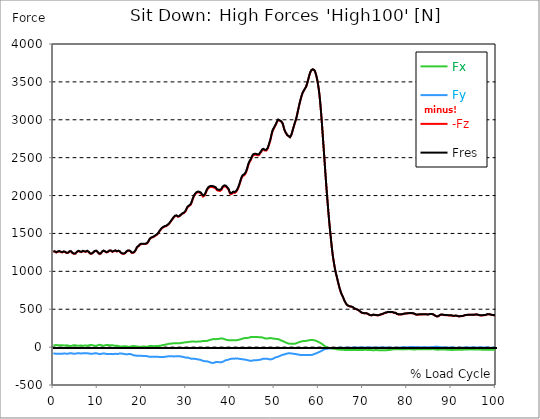
| Category |  Fx |  Fy |  -Fz |  Fres |
|---|---|---|---|---|
| 0.0 | 20.1 | -82.202 | 1262.724 | 1265.823 |
| 0.167348456675344 | 22.124 | -83.53 | 1262.439 | 1265.649 |
| 0.334696913350688 | 24.275 | -84.732 | 1260.177 | 1263.467 |
| 0.5020453700260321 | 26.251 | -86.329 | 1254.216 | 1257.663 |
| 0.669393826701376 | 27.77 | -88.1 | 1248.016 | 1251.622 |
| 0.83674228337672 | 26.046 | -88.496 | 1250.531 | 1254.121 |
| 1.0040907400520642 | 23.927 | -87.499 | 1258.359 | 1261.87 |
| 1.1621420602454444 | 22.282 | -85.997 | 1266.187 | 1269.571 |
| 1.3294905169207885 | 22.915 | -86.519 | 1264.843 | 1268.274 |
| 1.4968389735961325 | 23.927 | -87.072 | 1261.411 | 1264.922 |
| 1.6641874302714765 | 25.73 | -88.48 | 1254.01 | 1257.631 |
| 1.8315358869468206 | 27.343 | -90.393 | 1246.72 | 1250.483 |
| 1.9988843436221646 | 25.666 | -89.112 | 1249.329 | 1252.966 |
| 2.1662328002975086 | 23.658 | -87.12 | 1254.121 | 1257.6 |
| 2.333581256972853 | 21.839 | -84.526 | 1259.924 | 1263.198 |
| 2.5009297136481967 | 21.27 | -83.91 | 1258.375 | 1261.601 |
| 2.6682781703235405 | 21.381 | -84.732 | 1254.216 | 1257.489 |
| 2.8356266269988843 | 23.294 | -86.187 | 1246.198 | 1249.614 |
| 3.002975083674229 | 23.863 | -86.993 | 1242.197 | 1245.66 |
| 3.1703235403495724 | 22.741 | -86.63 | 1241.248 | 1244.664 |
| 3.337671997024917 | 21.27 | -86.313 | 1243.794 | 1247.147 |
| 3.4957233172182973 | 18.518 | -84.764 | 1251.733 | 1254.911 |
| 3.663071773893641 | 15.134 | -81.711 | 1262.012 | 1264.953 |
| 3.8304202305689854 | 13.853 | -79.972 | 1265.222 | 1268.037 |
| 3.997768687244329 | 14.486 | -80.019 | 1262.724 | 1265.554 |
| 4.165117143919673 | 17.791 | -81.601 | 1252.65 | 1255.623 |
| 4.332465600595017 | 21.57 | -84.273 | 1239.935 | 1243.177 |
| 4.499814057270361 | 24.164 | -86.724 | 1230.131 | 1233.641 |
| 4.667162513945706 | 23.737 | -87.12 | 1230.605 | 1234.132 |
| 4.834510970621049 | 22.946 | -85.823 | 1232.44 | 1235.84 |
| 5.001859427296393 | 24.116 | -86.124 | 1233.752 | 1237.168 |
| 5.169207883971737 | 22.203 | -84.764 | 1241.343 | 1244.616 |
| 5.336556340647081 | 18.961 | -82.439 | 1255.323 | 1258.406 |
| 5.503904797322425 | 18.55 | -80.905 | 1263.957 | 1266.946 |
| 5.671253253997769 | 18.518 | -80.525 | 1267.942 | 1270.884 |
| 5.82930457419115 | 18.724 | -80.604 | 1267.642 | 1270.583 |
| 5.996653030866494 | 19.973 | -81.964 | 1260.241 | 1263.293 |
| 6.164001487541838 | 21.618 | -84.273 | 1251.195 | 1254.437 |
| 6.331349944217181 | 21.207 | -84.843 | 1252.729 | 1256.003 |
| 6.498698400892526 | 18.882 | -83.087 | 1259.45 | 1262.55 |
| 6.66604685756787 | 15.862 | -80.272 | 1267.737 | 1270.599 |
| 6.833395314243213 | 17.601 | -80.652 | 1266.725 | 1269.634 |
| 7.000743770918558 | 20.021 | -81.617 | 1261.348 | 1264.352 |
| 7.168092227593902 | 21.017 | -82.518 | 1255.338 | 1258.422 |
| 7.335440684269246 | 20.036 | -82.17 | 1257.695 | 1260.747 |
| 7.50278914094459 | 18.882 | -81.474 | 1264.242 | 1267.231 |
| 7.6701375976199335 | 18.376 | -80.304 | 1268.464 | 1271.358 |
| 7.837486054295278 | 20.432 | -81 | 1264.716 | 1267.689 |
| 7.995537374488658 | 23.531 | -83.514 | 1254.026 | 1257.236 |
| 8.162885831164003 | 26.077 | -86.851 | 1240.805 | 1244.348 |
| 8.330234287839346 | 27.343 | -89.081 | 1232.234 | 1236.029 |
| 8.49758274451469 | 27.358 | -89.761 | 1230.02 | 1233.894 |
| 8.664931201190035 | 26.536 | -89.128 | 1232.803 | 1236.599 |
| 8.832279657865378 | 25.081 | -87.879 | 1237.848 | 1241.485 |
| 8.999628114540721 | 22.63 | -86.234 | 1245.265 | 1248.712 |
| 9.166976571216066 | 18.06 | -83.736 | 1257.679 | 1260.873 |
| 9.334325027891412 | 16.289 | -82.044 | 1265.934 | 1269.018 |
| 9.501673484566755 | 16.478 | -81.506 | 1268.179 | 1271.247 |
| 9.669021941242098 | 16.984 | -81.553 | 1270.504 | 1273.556 |
| 9.836370397917442 | 19.119 | -82.044 | 1265.001 | 1268.116 |
| 10.003718854592787 | 22.946 | -84.511 | 1254.753 | 1258.058 |
| 10.17106731126813 | 26.995 | -87.673 | 1242.292 | 1245.976 |
| 10.329118631461512 | 30.268 | -90.472 | 1231.491 | 1235.523 |
| 10.496467088136853 | 30.347 | -91.121 | 1228.043 | 1232.139 |
| 10.663815544812199 | 28.624 | -90.662 | 1231.254 | 1235.27 |
| 10.831164001487544 | 25.619 | -89.302 | 1240.331 | 1244.142 |
| 10.998512458162887 | 20.985 | -86.06 | 1257.631 | 1261.079 |
| 11.16586091483823 | 18.423 | -83.435 | 1270.061 | 1273.256 |
| 11.333209371513574 | 18.882 | -82.755 | 1270.868 | 1274.015 |
| 11.50055782818892 | 20.922 | -83.72 | 1266.883 | 1270.109 |
| 11.667906284864264 | 22.519 | -85.285 | 1261.964 | 1265.317 |
| 11.835254741539607 | 24.749 | -87.357 | 1255.924 | 1259.434 |
| 12.00260319821495 | 27.849 | -90.03 | 1249.503 | 1253.314 |
| 12.169951654890292 | 29.24 | -92.228 | 1248.87 | 1252.887 |
| 12.337300111565641 | 27.928 | -92.544 | 1255.481 | 1259.513 |
| 12.504648568240984 | 26.204 | -92.07 | 1264.89 | 1268.844 |
| 12.662699888434362 | 24.923 | -91.706 | 1272.354 | 1276.213 |
| 12.830048345109708 | 23.99 | -91.579 | 1274.537 | 1278.332 |
| 12.997396801785053 | 23.531 | -91.342 | 1272.275 | 1276.023 |
| 13.164745258460396 | 23.832 | -91.39 | 1265.317 | 1269.065 |
| 13.33209371513574 | 24.844 | -92.686 | 1257.268 | 1261.142 |
| 13.499442171811083 | 23.769 | -93.461 | 1256.398 | 1260.288 |
| 13.666790628486426 | 20.843 | -91.722 | 1264.368 | 1268.085 |
| 13.834139085161771 | 18.234 | -89.318 | 1271.88 | 1275.375 |
| 14.001487541837117 | 16.542 | -86.867 | 1273.904 | 1277.178 |
| 14.16883599851246 | 18.091 | -88.496 | 1267.958 | 1271.342 |
| 14.336184455187803 | 19.625 | -90.899 | 1261.553 | 1265.127 |
| 14.503532911863147 | 17.917 | -91.042 | 1264.463 | 1268.005 |
| 14.670881368538492 | 14.359 | -89.097 | 1269.508 | 1272.86 |
| 14.828932688731873 | 10.943 | -86.44 | 1271.026 | 1274.173 |
| 14.996281145407215 | 9.03 | -83.736 | 1262.945 | 1265.934 |
| 15.163629602082558 | 8.429 | -82.36 | 1248.744 | 1251.67 |
| 15.330978058757903 | 9.488 | -84.337 | 1239.935 | 1243.019 |
| 15.498326515433247 | 8.761 | -85.839 | 1235.239 | 1238.449 |
| 15.665674972108594 | 8.698 | -87.325 | 1231.934 | 1235.286 |
| 15.833023428783937 | 9.947 | -88.859 | 1230.827 | 1234.321 |
| 16.00037188545928 | 10.69 | -89.397 | 1231.475 | 1235.001 |
| 16.167720342134626 | 12.114 | -92.085 | 1236.504 | 1240.252 |
| 16.335068798809967 | 12.556 | -95.391 | 1246.229 | 1250.294 |
| 16.502417255485312 | 10.675 | -95.912 | 1257.505 | 1261.585 |
| 16.669765712160658 | 8.128 | -94.632 | 1266.661 | 1270.583 |
| 16.837114168836 | 6.405 | -94.046 | 1271.105 | 1274.916 |
| 17.004462625511344 | 3.653 | -91.627 | 1274.489 | 1278.111 |
| 17.16251394570472 | 3.258 | -90.789 | 1272.56 | 1276.086 |
| 17.32986240238007 | 3.179 | -89.951 | 1269.334 | 1272.813 |
| 17.497210859055414 | 5.835 | -91.643 | 1259.687 | 1263.293 |
| 17.664559315730756 | 10.232 | -96.308 | 1245.296 | 1249.234 |
| 17.8319077724061 | 13.742 | -101.7 | 1241.058 | 1245.518 |
| 17.999256229081443 | 14.407 | -105.259 | 1242.671 | 1247.463 |
| 18.166604685756788 | 13.426 | -106.413 | 1247.589 | 1252.476 |
| 18.333953142432133 | 13.015 | -109.086 | 1253.804 | 1258.912 |
| 18.501301599107478 | 12.019 | -110.794 | 1265.333 | 1270.567 |
| 18.668650055782823 | 11.07 | -112.739 | 1283.646 | 1288.975 |
| 18.835998512458165 | 8.745 | -113.972 | 1306.37 | 1311.684 |
| 19.00334696913351 | 6.658 | -113.292 | 1320.587 | 1325.79 |
| 19.170695425808855 | 5.756 | -113.023 | 1327.941 | 1333.065 |
| 19.338043882484197 | 6.12 | -113.972 | 1334.741 | 1339.928 |
| 19.496095202677576 | 6.199 | -115.127 | 1348.325 | 1353.56 |
| 19.66344365935292 | 6.326 | -115.728 | 1356.912 | 1362.178 |
| 19.830792116028263 | 6.231 | -115.585 | 1358.62 | 1363.87 |
| 19.998140572703612 | 5.851 | -115.285 | 1358.984 | 1364.218 |
| 20.165489029378953 | 6.61 | -115.791 | 1359.632 | 1364.914 |
| 20.3328374860543 | 7.29 | -116.297 | 1360.17 | 1365.515 |
| 20.500185942729644 | 7.037 | -116.929 | 1359.348 | 1364.709 |
| 20.667534399404985 | 6.8 | -117.562 | 1358.525 | 1363.902 |
| 20.83488285608033 | 5.661 | -117.799 | 1359.775 | 1365.151 |
| 21.002231312755672 | 4.681 | -118.147 | 1361.609 | 1366.954 |
| 21.16957976943102 | 5.329 | -119.475 | 1367.033 | 1372.473 |
| 21.336928226106362 | 6.436 | -121.484 | 1376.126 | 1381.725 |
| 21.504276682781704 | 10.864 | -125.754 | 1392.194 | 1398.155 |
| 21.67162513945705 | 13.505 | -127.651 | 1412.894 | 1418.935 |
| 21.82967645965043 | 13.679 | -127.303 | 1428.028 | 1433.943 |
| 21.997024916325774 | 12.983 | -126.845 | 1436.141 | 1441.945 |
| 22.16437337300112 | 13.458 | -126.797 | 1442.672 | 1448.476 |
| 22.33172182967646 | 13.379 | -126.291 | 1446.673 | 1452.414 |
| 22.499070286351806 | 11.544 | -125.263 | 1449.346 | 1454.944 |
| 22.666418743027148 | 12.177 | -125.58 | 1453.125 | 1458.755 |
| 22.833767199702496 | 13.363 | -127.446 | 1460.036 | 1465.808 |
| 23.00111565637784 | 13.505 | -128.157 | 1468.734 | 1474.538 |
| 23.168464113053183 | 13.331 | -127.43 | 1473.937 | 1479.63 |
| 23.335812569728528 | 13.41 | -127.383 | 1479.329 | 1485.006 |
| 23.50316102640387 | 14.28 | -127.873 | 1487.094 | 1492.819 |
| 23.670509483079215 | 14.881 | -128.505 | 1497.816 | 1503.572 |
| 23.83785793975456 | 15.988 | -130.276 | 1512.618 | 1518.485 |
| 23.995909259947936 | 16.795 | -129.786 | 1528.59 | 1534.394 |
| 24.163257716623285 | 17.554 | -129.723 | 1542 | 1547.757 |
| 24.330606173298627 | 19.831 | -130.229 | 1552.944 | 1558.763 |
| 24.49795462997397 | 23.136 | -131.178 | 1565.2 | 1571.13 |
| 24.665303086649313 | 25.714 | -131.383 | 1572.49 | 1578.436 |
| 24.83265154332466 | 27.754 | -131.051 | 1580.35 | 1586.264 |
| 25.0 | 28.924 | -129.865 | 1588.51 | 1594.329 |
| 25.167348456675345 | 30.126 | -128.616 | 1590.629 | 1596.338 |
| 25.334696913350694 | 31.85 | -127.035 | 1593.112 | 1598.726 |
| 25.502045370026035 | 34.222 | -124.979 | 1596.053 | 1601.54 |
| 25.669393826701377 | 36.926 | -123.065 | 1602.315 | 1607.724 |
| 25.836742283376722 | 39.788 | -121.389 | 1609.621 | 1614.967 |
| 26.004090740052067 | 42.477 | -121.958 | 1619.189 | 1624.629 |
| 26.17143919672741 | 43.584 | -121.199 | 1626.811 | 1632.22 |
| 26.329490516920792 | 44.469 | -120.598 | 1638.166 | 1643.527 |
| 26.49683897359613 | 45.576 | -120.108 | 1653.347 | 1658.677 |
| 26.66418743027148 | 47.158 | -119.902 | 1667.027 | 1672.34 |
| 26.831535886946828 | 46.968 | -120.266 | 1678.413 | 1683.71 |
| 26.998884343622166 | 48.802 | -122.037 | 1692.914 | 1698.339 |
| 27.166232800297514 | 50.162 | -122.48 | 1708.618 | 1714.074 |
| 27.333581256972852 | 51.491 | -123.034 | 1720.115 | 1725.618 |
| 27.5009297136482 | 51.348 | -122.195 | 1727.879 | 1733.288 |
| 27.668278170323543 | 51.554 | -121.088 | 1734.157 | 1739.471 |
| 27.835626626998888 | 51.76 | -120.124 | 1733.983 | 1739.234 |
| 28.002975083674233 | 52.013 | -120.82 | 1727.247 | 1732.576 |
| 28.170323540349575 | 50.336 | -121.12 | 1720.336 | 1725.665 |
| 28.33767199702492 | 49.893 | -120.567 | 1721.696 | 1726.994 |
| 28.50502045370026 | 51.839 | -121.389 | 1725.286 | 1730.694 |
| 28.663071773893645 | 51.522 | -121.436 | 1734.221 | 1739.629 |
| 28.830420230568986 | 53.847 | -123.903 | 1744.168 | 1749.813 |
| 28.99776868724433 | 55.808 | -126.117 | 1755.475 | 1761.326 |
| 29.165117143919673 | 56.883 | -126.956 | 1759.112 | 1765.074 |
| 29.33246560059502 | 57.895 | -128.822 | 1763.398 | 1769.581 |
| 29.499814057270367 | 59.129 | -131.178 | 1768.427 | 1774.863 |
| 29.66716251394571 | 62.039 | -134.736 | 1776.792 | 1783.766 |
| 29.834510970621054 | 64.506 | -137.899 | 1786.85 | 1794.298 |
| 30.00185942729639 | 65.217 | -139.006 | 1804.593 | 1812.168 |
| 30.169207883971744 | 64.98 | -137.772 | 1826.986 | 1834.45 |
| 30.33655634064708 | 65.217 | -137.25 | 1846.09 | 1853.506 |
| 30.50390479732243 | 67.052 | -140.002 | 1855.214 | 1862.9 |
| 30.671253253997772 | 68.586 | -143.639 | 1861.066 | 1869.162 |
| 30.829304574191156 | 70.135 | -147.261 | 1866.917 | 1875.409 |
| 30.996653030866494 | 71.401 | -149.712 | 1876.026 | 1884.771 |
| 31.164001487541842 | 73.298 | -152.701 | 1893.437 | 1902.404 |
| 31.331349944217187 | 74.532 | -154.298 | 1920.447 | 1929.477 |
| 31.498698400892525 | 74.279 | -154.298 | 1949.53 | 1958.401 |
| 31.666046857567874 | 73.346 | -153.602 | 1974.073 | 1982.802 |
| 31.833395314243212 | 72.682 | -153.713 | 1995.596 | 2004.215 |
| 32.00074377091856 | 72.223 | -154.693 | 2013.529 | 2022.116 |
| 32.1680922275939 | 71.401 | -155.99 | 2026.022 | 2034.673 |
| 32.33544068426925 | 71.575 | -158.014 | 2034.341 | 2043.149 |
| 32.50278914094459 | 72.334 | -159.928 | 2039.717 | 2048.684 |
| 32.670137597619934 | 72.84 | -162.126 | 2043.544 | 2052.637 |
| 32.83748605429528 | 72.555 | -163.091 | 2045.41 | 2054.519 |
| 33.004834510970625 | 73.662 | -165.321 | 2041.156 | 2050.423 |
| 33.162885831164004 | 74.247 | -167.234 | 2036.523 | 2046.027 |
| 33.33023428783935 | 74.816 | -169.337 | 2030.593 | 2040.366 |
| 33.497582744514695 | 76.477 | -173.212 | 2018.4 | 2028.568 |
| 33.664931201190036 | 78.912 | -177.624 | 2000.245 | 2010.841 |
| 33.83227965786538 | 81 | -181.783 | 1986.693 | 1997.747 |
| 33.99962811454073 | 81.569 | -184.408 | 1989.998 | 2001.4 |
| 34.16697657121607 | 81.522 | -185.389 | 2001.621 | 2013.118 |
| 34.33432502789141 | 81.49 | -186.369 | 2015.854 | 2027.43 |
| 34.50167348456676 | 81.284 | -186.575 | 2038.689 | 2050.234 |
| 34.6690219412421 | 80.731 | -186.511 | 2064.925 | 2076.438 |
| 34.83637039791744 | 83.119 | -188.947 | 2081.182 | 2092.963 |
| 35.00371885459279 | 86.756 | -192.315 | 2095.43 | 2107.591 |
| 35.17106731126814 | 90.156 | -194.893 | 2105.298 | 2117.776 |
| 35.338415767943474 | 92.829 | -197.233 | 2109.884 | 2122.646 |
| 35.49646708813686 | 95.375 | -201.108 | 2112.668 | 2125.936 |
| 35.6638155448122 | 99.17 | -205.441 | 2113.933 | 2127.818 |
| 35.831164001487544 | 101.764 | -208.904 | 2113.158 | 2127.596 |
| 35.998512458162885 | 103.883 | -210.122 | 2111.497 | 2126.252 |
| 36.165860914838234 | 105.844 | -209.046 | 2109.505 | 2124.275 |
| 36.333209371513576 | 106.951 | -207.165 | 2104.555 | 2119.246 |
| 36.50055782818892 | 106.824 | -203.67 | 2100.016 | 2114.391 |
| 36.667906284864266 | 104.721 | -197.581 | 2097.281 | 2110.849 |
| 36.83525474153961 | 104.389 | -196.791 | 2084.898 | 2098.277 |
| 37.002603198214956 | 106.002 | -197.692 | 2070.144 | 2083.728 |
| 37.1699516548903 | 108.089 | -198.815 | 2059.691 | 2073.544 |
| 37.337300111565646 | 107.805 | -197.55 | 2064.292 | 2077.972 |
| 37.50464856824098 | 109.149 | -198.135 | 2064.435 | 2078.288 |
| 37.66269988843437 | 111.901 | -200.428 | 2060.703 | 2075.014 |
| 37.83004834510971 | 114.209 | -201.772 | 2063.264 | 2077.893 |
| 37.99739680178505 | 115.981 | -201.266 | 2073.718 | 2088.409 |
| 38.16474525846039 | 113.355 | -196.711 | 2094.292 | 2108.793 |
| 38.33209371513574 | 110.73 | -192.932 | 2108.24 | 2122.425 |
| 38.49944217181109 | 109.054 | -189.042 | 2115.941 | 2129.652 |
| 38.666790628486424 | 106.745 | -183.238 | 2121.634 | 2134.744 |
| 38.83413908516178 | 102.08 | -177.829 | 2122.283 | 2134.713 |
| 39.001487541837115 | 97.794 | -172.753 | 2118.124 | 2130.079 |
| 39.16883599851246 | 95.217 | -170.555 | 2107.939 | 2119.737 |
| 39.336184455187805 | 93.92 | -169.764 | 2097.486 | 2109.22 |
| 39.503532911863154 | 92.623 | -167.566 | 2087.523 | 2099.162 |
| 39.670881368538495 | 90.789 | -163.866 | 2072.184 | 2083.665 |
| 39.83822982521384 | 91.295 | -159.722 | 2040.524 | 2052.021 |
| 39.996281145407224 | 90.457 | -156.354 | 2022.085 | 2033.597 |
| 40.163629602082565 | 90.82 | -154.346 | 2016.866 | 2028.537 |
| 40.33097805875791 | 91.342 | -153.681 | 2021.974 | 2033.74 |
| 40.498326515433256 | 91.073 | -152.195 | 2032.68 | 2044.288 |
| 40.6656749721086 | 91.073 | -151.641 | 2039.575 | 2051.214 |
| 40.83302342878393 | 91.358 | -152.116 | 2035.416 | 2047.292 |
| 41.00037188545929 | 91.959 | -152.29 | 2034.246 | 2046.328 |
| 41.16772034213463 | 91.769 | -151.357 | 2038.689 | 2050.866 |
| 41.33506879880997 | 90.884 | -149.491 | 2048.842 | 2061.035 |
| 41.50241725548531 | 90.71 | -148.479 | 2061.968 | 2074.066 |
| 41.66976571216066 | 92.528 | -150.171 | 2080.027 | 2092.236 |
| 41.837114168836 | 95.612 | -152.068 | 2103.401 | 2115.751 |
| 42.004462625511344 | 98.395 | -154.535 | 2130.617 | 2142.968 |
| 42.17181108218669 | 101.353 | -156.971 | 2160.537 | 2172.856 |
| 42.32986240238007 | 103.788 | -157.619 | 2192.75 | 2204.959 |
| 42.497210859055414 | 106.081 | -157.366 | 2221.405 | 2233.456 |
| 42.66455931573076 | 109.244 | -159.153 | 2244.715 | 2256.797 |
| 42.831907772406105 | 112.754 | -161.177 | 2258.742 | 2271.03 |
| 42.999256229081446 | 116.028 | -162.711 | 2263.186 | 2275.806 |
| 43.16660468575679 | 117.926 | -162.996 | 2268.263 | 2281.04 |
| 43.33395314243214 | 119.744 | -164.799 | 2278.194 | 2291.177 |
| 43.50130159910748 | 120.804 | -167.424 | 2296.206 | 2309.316 |
| 43.66865005578282 | 120.646 | -169.132 | 2321.904 | 2334.935 |
| 43.83599851245817 | 120.978 | -170.476 | 2350.986 | 2363.985 |
| 44.00334696913351 | 122.338 | -173.212 | 2386.188 | 2399.33 |
| 44.17069542580886 | 123.872 | -176.896 | 2417.563 | 2430.847 |
| 44.3380438824842 | 126.228 | -178.968 | 2439.276 | 2452.766 |
| 44.49609520267758 | 131.225 | -182.51 | 2449.381 | 2463.772 |
| 44.66344365935292 | 133.993 | -180.913 | 2469.623 | 2483.888 |
| 44.83079211602827 | 134.689 | -178.889 | 2495.59 | 2509.586 |
| 44.99814057270361 | 134.704 | -178.114 | 2514.852 | 2528.752 |
| 45.16548902937895 | 133.471 | -175.774 | 2531.061 | 2544.661 |
| 45.332837486054295 | 132.269 | -172.785 | 2537.418 | 2550.718 |
| 45.500185942729644 | 132.522 | -171.33 | 2538.146 | 2551.287 |
| 45.66753439940499 | 132.538 | -172.136 | 2540.091 | 2553.264 |
| 45.83488285608033 | 133.503 | -172.484 | 2537.165 | 2550.465 |
| 46.00223131275568 | 134.594 | -171.899 | 2532.057 | 2545.452 |
| 46.16957976943102 | 133.06 | -171.63 | 2530.397 | 2543.618 |
| 46.336928226106366 | 131.526 | -171.361 | 2528.752 | 2541.783 |
| 46.50427668278171 | 131.241 | -171.14 | 2534.809 | 2547.84 |
| 46.671625139457056 | 131.051 | -166.601 | 2548.963 | 2561.393 |
| 46.829676459650436 | 131.526 | -165.02 | 2556.253 | 2568.604 |
| 46.99702491632577 | 130.087 | -163.122 | 2575.277 | 2587.486 |
| 47.16437337300112 | 127.651 | -158.188 | 2595.519 | 2607.238 |
| 47.33172182967646 | 125.706 | -154.678 | 2603.774 | 2615.097 |
| 47.49907028635181 | 124.726 | -153.239 | 2605.704 | 2616.837 |
| 47.66641874302716 | 120.187 | -152.938 | 2594.049 | 2604.881 |
| 47.83376719970249 | 116.344 | -154.804 | 2593.163 | 2603.948 |
| 48.001115656377834 | 112.581 | -153.428 | 2589.842 | 2600.358 |
| 48.16846411305319 | 111.268 | -153.049 | 2593.717 | 2604.027 |
| 48.33581256972853 | 112.486 | -154.124 | 2603.442 | 2614.006 |
| 48.50316102640387 | 114.652 | -156.401 | 2623.052 | 2634.074 |
| 48.67050948307921 | 116.36 | -158.378 | 2653.494 | 2664.801 |
| 48.837857939754564 | 118.416 | -160.592 | 2684.553 | 2696.097 |
| 49.005206396429905 | 119.744 | -162.332 | 2714.884 | 2726.492 |
| 49.163257716623285 | 119.523 | -162.569 | 2754.467 | 2765.869 |
| 49.33060617329863 | 117.388 | -159.659 | 2800.233 | 2810.971 |
| 49.49795462997397 | 114.905 | -156.686 | 2839.088 | 2849.193 |
| 49.66530308664932 | 112.913 | -153.839 | 2865.687 | 2875.334 |
| 49.832651543324666 | 111.711 | -147.798 | 2879.224 | 2888.286 |
| 50.0 | 110.794 | -141.283 | 2900.526 | 2908.891 |
| 50.16734845667534 | 109.687 | -137.598 | 2919.218 | 2927.093 |
| 50.33469691335069 | 108.374 | -134.341 | 2939.065 | 2946.466 |
| 50.50204537002604 | 106.824 | -132.411 | 2962.217 | 2969.333 |
| 50.66939382670139 | 106.698 | -129.739 | 2982.569 | 2989.401 |
| 50.836742283376715 | 104.863 | -125.358 | 2997.261 | 3003.539 |
| 51.00409074005207 | 103.361 | -122.148 | 3002.337 | 3008.125 |
| 51.17143919672741 | 97.32 | -117.151 | 2987.993 | 2993.228 |
| 51.32949051692079 | 90.725 | -112.739 | 2977.809 | 2982.553 |
| 51.496838973596134 | 86.788 | -108.69 | 2977.208 | 2981.62 |
| 51.66418743027148 | 84.542 | -105.464 | 2969.712 | 2973.871 |
| 51.831535886946824 | 80.415 | -101.922 | 2951.7 | 2955.59 |
| 51.99888434362217 | 75.797 | -99.028 | 2918.775 | 2922.318 |
| 52.16623280029752 | 71.242 | -96.592 | 2879.256 | 2882.466 |
| 52.33358125697285 | 66.894 | -94.347 | 2853.637 | 2856.594 |
| 52.5009297136482 | 61.517 | -90.33 | 2832.051 | 2834.613 |
| 52.668278170323546 | 57.706 | -87.958 | 2818.166 | 2820.522 |
| 52.835626626998895 | 53.594 | -86.329 | 2799.189 | 2801.403 |
| 53.00297508367424 | 50.289 | -83.23 | 2789.716 | 2791.788 |
| 53.17032354034958 | 47.458 | -79.671 | 2784.593 | 2786.569 |
| 53.33767199702492 | 46.304 | -80.889 | 2775.073 | 2777.018 |
| 53.50502045370027 | 45.892 | -83.087 | 2768.731 | 2770.66 |
| 53.663071773893655 | 43.868 | -83.34 | 2780.861 | 2782.679 |
| 53.83042023056899 | 43.331 | -84.779 | 2803 | 2804.819 |
| 53.99776868724433 | 43.331 | -84.827 | 2837.048 | 2838.835 |
| 54.16511714391967 | 43.204 | -86.424 | 2871.349 | 2873.152 |
| 54.33246560059503 | 43.078 | -88.005 | 2905.665 | 2907.468 |
| 54.49981405727037 | 43.679 | -89.935 | 2938.669 | 2940.504 |
| 54.667162513945705 | 45.687 | -91.975 | 2969.38 | 2971.31 |
| 54.834510970621054 | 48.217 | -92.117 | 3000.123 | 3002.052 |
| 55.0018594272964 | 50.906 | -92.892 | 3035.705 | 3037.666 |
| 55.169207883971744 | 55.049 | -95.185 | 3079.778 | 3081.85 |
| 55.336556340647086 | 60.979 | -98.3 | 3125.924 | 3128.154 |
| 55.50390479732243 | 63.62 | -99.66 | 3169.903 | 3172.196 |
| 55.671253253997776 | 66.815 | -101.716 | 3213.471 | 3215.875 |
| 55.83860171067312 | 70.989 | -103.551 | 3253.18 | 3255.71 |
| 55.9966530308665 | 73.757 | -104.025 | 3288.651 | 3291.244 |
| 56.16400148754184 | 75.765 | -104.12 | 3321.022 | 3323.648 |
| 56.33134994421718 | 78.248 | -104.057 | 3349.915 | 3352.572 |
| 56.498698400892536 | 79.15 | -103.361 | 3370.315 | 3372.956 |
| 56.66604685756788 | 79.909 | -103.108 | 3387.268 | 3389.909 |
| 56.83339531424321 | 80.193 | -102.807 | 3403.793 | 3406.419 |
| 57.00074377091856 | 80.478 | -102.491 | 3420.319 | 3422.944 |
| 57.16809222759391 | 80.968 | -102.301 | 3438.743 | 3441.368 |
| 57.33544068426925 | 83.878 | -103.756 | 3467.856 | 3470.576 |
| 57.5027891409446 | 86.74 | -105.353 | 3501.113 | 3503.944 |
| 57.670137597619934 | 89.144 | -105.717 | 3538.292 | 3541.17 |
| 57.83748605429528 | 91.073 | -105.037 | 3577.701 | 3580.595 |
| 58.004834510970625 | 92.418 | -104.768 | 3609.329 | 3612.223 |
| 58.16288583116401 | 93.192 | -103.677 | 3635.739 | 3638.601 |
| 58.330234287839346 | 94.663 | -102.76 | 3652.739 | 3655.601 |
| 58.497582744514695 | 95.343 | -101.653 | 3660.994 | 3663.824 |
| 58.66493120119004 | 94.821 | -99.486 | 3664.378 | 3667.13 |
| 58.832279657865385 | 93.192 | -95.691 | 3663.034 | 3665.659 |
| 58.999628114540734 | 90.014 | -91.01 | 3653.466 | 3655.917 |
| 59.16697657121607 | 86.867 | -87.041 | 3635.581 | 3637.874 |
| 59.33432502789142 | 83.91 | -83.751 | 3605.708 | 3607.89 |
| 59.50167348456676 | 80.43 | -80.177 | 3569.794 | 3571.85 |
| 59.66902194124211 | 76.082 | -75.971 | 3523.411 | 3525.246 |
| 59.83637039791745 | 71.053 | -71.796 | 3468.441 | 3470.118 |
| 60.00371885459278 | 66.799 | -67.937 | 3407.415 | 3408.949 |
| 60.17106731126813 | 61.77 | -63.478 | 3326.51 | 3327.902 |
| 60.33841576794349 | 56.488 | -58.37 | 3230.076 | 3231.293 |
| 60.49646708813685 | 51.032 | -53.942 | 3116.372 | 3117.448 |
| 60.6638155448122 | 44.343 | -48.96 | 2994.114 | 2995.047 |
| 60.831164001487544 | 37.242 | -43.758 | 2858.587 | 2859.393 |
| 60.99851245816289 | 29.066 | -37.4 | 2717.715 | 2718.379 |
| 61.16586091483824 | 21.333 | -32.261 | 2581.682 | 2582.267 |
| 61.333209371513576 | 14.075 | -28.339 | 2442.249 | 2442.739 |
| 61.50055782818892 | 8.255 | -25.461 | 2302.548 | 2302.99 |
| 61.667906284864266 | 3.147 | -23.168 | 2166.673 | 2167.068 |
| 61.835254741539615 | -1.139 | -21.665 | 2037.725 | 2038.104 |
| 62.002603198214956 | -4.238 | -20.875 | 1913.853 | 1914.217 |
| 62.16995165489029 | -7.954 | -19.293 | 1793.697 | 1794.077 |
| 62.33730011156564 | -10.722 | -17.854 | 1681.892 | 1682.303 |
| 62.504648568240995 | -12.873 | -16.035 | 1577.788 | 1578.246 |
| 62.67199702491633 | -15.134 | -13.901 | 1479.124 | 1479.598 |
| 62.83004834510971 | -17.396 | -12.873 | 1383.875 | 1384.381 |
| 62.99739680178505 | -19.151 | -12.398 | 1295.174 | 1295.728 |
| 63.1647452584604 | -20.448 | -12.114 | 1214.238 | 1214.838 |
| 63.33209371513575 | -21.317 | -12.129 | 1148.087 | 1148.736 |
| 63.4994421718111 | -21.27 | -13.252 | 1089.227 | 1089.86 |
| 63.666790628486424 | -21.823 | -13.505 | 1033.83 | 1034.4 |
| 63.83413908516177 | -24.116 | -12.129 | 988.286 | 988.824 |
| 64.00148754183712 | -26.916 | -10.706 | 947.928 | 948.498 |
| 64.16883599851248 | -29.288 | -9.694 | 908.187 | 908.788 |
| 64.3361844551878 | -30.363 | -9.552 | 865.315 | 865.98 |
| 64.50353291186315 | -30.98 | -9.046 | 825.891 | 826.587 |
| 64.6708813685385 | -30.948 | -9.473 | 787.842 | 788.585 |
| 64.83822982521384 | -33.684 | -8.714 | 754.87 | 755.771 |
| 65.00557828188919 | -34.475 | -8.808 | 724.95 | 725.914 |
| 65.16362960208257 | -34.032 | -9.141 | 699.568 | 700.564 |
| 65.3309780587579 | -33.336 | -11.054 | 678.409 | 679.452 |
| 65.49832651543326 | -35.044 | -9.963 | 658.277 | 659.463 |
| 65.6656749721086 | -36.246 | -9.473 | 632.39 | 633.671 |
| 65.83302342878395 | -36.926 | -9.821 | 609.95 | 611.341 |
| 66.00037188545929 | -38.365 | -9.378 | 591.779 | 593.281 |
| 66.16772034213463 | -39.124 | -9.235 | 574.637 | 576.25 |
| 66.33506879880998 | -39.504 | -8.872 | 560.309 | 562.017 |
| 66.50241725548531 | -39.836 | -8.255 | 550.014 | 551.769 |
| 66.66976571216065 | -39.772 | -8.397 | 544.954 | 546.725 |
| 66.83711416883601 | -39.535 | -8.445 | 540.905 | 542.661 |
| 67.00446262551135 | -39.156 | -8.445 | 537.632 | 539.403 |
| 67.1718110821867 | -39.251 | -7.828 | 535.687 | 537.442 |
| 67.32986240238007 | -39.44 | -7.164 | 533.994 | 535.75 |
| 67.49721085905541 | -39.409 | -6.942 | 531.954 | 533.726 |
| 67.66455931573076 | -39.314 | -6.768 | 528.317 | 530.088 |
| 67.83190777240611 | -39.092 | -6.721 | 519.714 | 521.485 |
| 67.99925622908145 | -39.124 | -6.531 | 511.538 | 513.341 |
| 68.16660468575678 | -38.887 | -6.136 | 505.45 | 507.253 |
| 68.33395314243214 | -38.017 | -5.646 | 503.204 | 504.944 |
| 68.50130159910749 | -38.001 | -5.772 | 500.389 | 502.161 |
| 68.66865005578282 | -38.08 | -5.472 | 495.93 | 497.717 |
| 68.83599851245816 | -38.144 | -5.108 | 491.138 | 492.941 |
| 69.00334696913352 | -38.144 | -4.792 | 486.536 | 488.355 |
| 69.17069542580886 | -38.017 | -4.871 | 479.278 | 481.096 |
| 69.3380438824842 | -37.875 | -5.061 | 471.007 | 472.857 |
| 69.50539233915956 | -38.144 | -5.187 | 462.531 | 464.397 |
| 69.66344365935292 | -38.349 | -5.076 | 455.319 | 457.201 |
| 69.83079211602826 | -38.318 | -4.349 | 451.556 | 453.422 |
| 69.99814057270362 | -37.622 | -4.301 | 448.709 | 450.496 |
| 70.16548902937896 | -36.989 | -4.143 | 446.384 | 448.092 |
| 70.33283748605429 | -36.436 | -3.922 | 445.989 | 447.634 |
| 70.50018594272964 | -35.518 | -4.523 | 446.606 | 448.203 |
| 70.667534399405 | -35.851 | -4.523 | 447.033 | 448.693 |
| 70.83488285608033 | -36.736 | -4.776 | 445.546 | 447.302 |
| 71.00223131275568 | -36.942 | -5.725 | 441.182 | 443.016 |
| 71.16957976943102 | -36.863 | -6.753 | 435.141 | 437.022 |
| 71.33692822610637 | -37.432 | -6.626 | 429.337 | 431.298 |
| 71.50427668278171 | -37.985 | -6.5 | 423.517 | 425.557 |
| 71.67162513945706 | -38.602 | -6.547 | 420.386 | 422.505 |
| 71.8389735961324 | -39.219 | -6.626 | 417.792 | 419.991 |
| 71.99702491632577 | -39.899 | -6.5 | 418.852 | 421.113 |
| 72.16437337300113 | -40.421 | -6.405 | 423.28 | 425.589 |
| 72.33172182967647 | -40.5 | -6.658 | 426.965 | 429.274 |
| 72.49907028635181 | -40.563 | -6.594 | 427.249 | 429.574 |
| 72.66641874302715 | -39.978 | -7.211 | 423.786 | 426.111 |
| 72.8337671997025 | -38.412 | -8.35 | 421.098 | 423.248 |
| 73.00111565637783 | -38.571 | -7.164 | 420.702 | 422.869 |
| 73.16846411305319 | -39.377 | -6.452 | 419.579 | 421.873 |
| 73.33581256972853 | -39.915 | -5.772 | 418.646 | 421.034 |
| 73.50316102640387 | -39.693 | -5.203 | 418.267 | 420.655 |
| 73.67050948307921 | -40.358 | -4.618 | 420.639 | 423.106 |
| 73.83785793975457 | -41.132 | -4.412 | 425.304 | 427.834 |
| 74.00520639642991 | -41.67 | -4.301 | 429.59 | 432.183 |
| 74.16325771662328 | -41.417 | -3.985 | 431.93 | 434.461 |
| 74.33060617329863 | -41.654 | -4.112 | 434.208 | 436.769 |
| 74.49795462997398 | -42.492 | -4.744 | 437.212 | 439.869 |
| 74.66530308664932 | -42.097 | -5.693 | 442.383 | 444.977 |
| 74.83265154332466 | -42.287 | -5.835 | 447.46 | 450.101 |
| 75.00000000000001 | -42.255 | -6.136 | 451.983 | 454.671 |
| 75.16734845667534 | -40.927 | -7.037 | 454.291 | 456.695 |
| 75.3346969133507 | -40.785 | -6.626 | 455.05 | 457.423 |
| 75.50204537002605 | -40.263 | -6.5 | 457.976 | 460.285 |
| 75.66939382670138 | -38.918 | -6.215 | 463.274 | 465.314 |
| 75.83674228337672 | -38.159 | -6.958 | 462.499 | 464.491 |
| 76.00409074005208 | -37.385 | -7.701 | 461.724 | 463.669 |
| 76.17143919672742 | -36.388 | -7.86 | 460.443 | 462.278 |
| 76.33878765340276 | -34.933 | -8.682 | 460.997 | 462.689 |
| 76.49683897359614 | -32.277 | -8.666 | 462.372 | 463.796 |
| 76.66418743027148 | -30.505 | -7.607 | 462.625 | 463.922 |
| 76.83153588694682 | -29.161 | -7.939 | 459.036 | 460.253 |
| 76.99888434362218 | -28.608 | -8.54 | 451.888 | 453.09 |
| 77.16623280029752 | -28.861 | -7.97 | 451.65 | 452.868 |
| 77.33358125697285 | -28.766 | -7.717 | 452.568 | 453.817 |
| 77.5009297136482 | -28.165 | -8.824 | 444.36 | 445.657 |
| 77.66827817032356 | -28.845 | -7.749 | 438.968 | 440.312 |
| 77.83562662699889 | -29.493 | -7.717 | 433.132 | 434.555 |
| 78.00297508367423 | -29.43 | -7.322 | 431.551 | 433.006 |
| 78.17032354034959 | -29.398 | -6.357 | 431.298 | 432.768 |
| 78.33767199702493 | -29.383 | -5.393 | 431.045 | 432.515 |
| 78.50502045370027 | -29.398 | -4.776 | 431.266 | 432.753 |
| 78.67236891037561 | -29.43 | -4.444 | 431.867 | 433.385 |
| 78.83042023056899 | -29.762 | -3.748 | 433.006 | 434.524 |
| 78.99776868724433 | -30.205 | -2.926 | 434.318 | 435.884 |
| 79.16511714391969 | -30.031 | -2.483 | 437.196 | 438.746 |
| 79.33246560059503 | -29.13 | -2.767 | 441.308 | 442.763 |
| 79.49981405727036 | -28.102 | -2.451 | 442.02 | 443.459 |
| 79.66716251394571 | -27.453 | -1.328 | 443.063 | 444.518 |
| 79.83451097062107 | -27.153 | 0.032 | 444.613 | 446.052 |
| 80.00185942729641 | -27.026 | -0.38 | 444.74 | 446.131 |
| 80.16920788397174 | -26.631 | -1.645 | 445.768 | 447.017 |
| 80.33655634064709 | -26.03 | -3.226 | 447.649 | 448.788 |
| 80.50390479732243 | -26.789 | -2.483 | 447.365 | 448.535 |
| 80.67125325399778 | -26.837 | -1.613 | 448.393 | 449.579 |
| 80.83860171067312 | -27.517 | -0.854 | 449.848 | 451.113 |
| 80.99665303086651 | -28.797 | 0.522 | 447.491 | 448.883 |
| 81.16400148754184 | -29.62 | 1.249 | 445.91 | 447.396 |
| 81.3313499442172 | -30.648 | 1.455 | 446.005 | 447.539 |
| 81.49869840089255 | -30.505 | 0.617 | 442.795 | 444.281 |
| 81.66604685756786 | -31.201 | 0.459 | 438.873 | 440.407 |
| 81.83339531424322 | -31.091 | 0.127 | 434.113 | 435.615 |
| 82.00074377091858 | -29.699 | -1.249 | 428.182 | 429.511 |
| 82.16809222759392 | -29.572 | -1.676 | 427.376 | 428.688 |
| 82.33544068426926 | -29.43 | -2.214 | 427.629 | 428.941 |
| 82.50278914094459 | -29.098 | -3.068 | 427.945 | 429.242 |
| 82.67013759761994 | -29.114 | -3.511 | 430.966 | 432.231 |
| 82.83748605429528 | -28.481 | -3.163 | 430.238 | 431.424 |
| 83.00483451097062 | -28.576 | -3.084 | 431.045 | 432.247 |
| 83.17218296764597 | -28.576 | -2.483 | 434.84 | 436.058 |
| 83.33023428783935 | -28.117 | -3.163 | 431.867 | 433.101 |
| 83.4975827445147 | -28.544 | -2.704 | 429.906 | 431.219 |
| 83.66493120119004 | -27.896 | -2.246 | 432.167 | 433.433 |
| 83.83227965786537 | -27.548 | -2.151 | 433.559 | 434.84 |
| 83.99962811454073 | -27.801 | -1.834 | 433.512 | 434.856 |
| 84.16697657121607 | -27.912 | -1.929 | 430.823 | 432.167 |
| 84.33432502789142 | -28.117 | -0.996 | 432.31 | 433.638 |
| 84.50167348456677 | -27.864 | -0.775 | 429.558 | 430.823 |
| 84.6690219412421 | -27.501 | -0.949 | 429.005 | 430.238 |
| 84.83637039791745 | -27.169 | -1.091 | 431.646 | 432.863 |
| 85.0037188545928 | -27.248 | -1.344 | 434.413 | 435.631 |
| 85.17106731126813 | -26.916 | -1.471 | 435.979 | 437.181 |
| 85.33841576794349 | -27.263 | -0.648 | 437.418 | 438.604 |
| 85.50576422461883 | -26.236 | -1.487 | 436.69 | 437.797 |
| 85.66381554481221 | -26.125 | -0.996 | 435.188 | 436.295 |
| 85.83116400148755 | -26.536 | 0.221 | 434.461 | 435.583 |
| 85.99851245816289 | -26.837 | 0.617 | 427.85 | 428.989 |
| 86.16586091483823 | -28.971 | 3.938 | 420.433 | 421.809 |
| 86.33320937151358 | -31.091 | 5.298 | 414.029 | 415.658 |
| 86.50055782818893 | -31.897 | 5.092 | 407.545 | 409.205 |
| 86.66790628486427 | -33.004 | 4.207 | 404.05 | 405.805 |
| 86.83525474153961 | -33.542 | 3.827 | 403.971 | 405.758 |
| 87.00260319821496 | -33.905 | 4.127 | 406.248 | 408.035 |
| 87.16995165489031 | -33.542 | 3.495 | 411.356 | 413.064 |
| 87.33730011156564 | -32.688 | 1.423 | 419.785 | 421.303 |
| 87.504648568241 | -32.451 | -0.427 | 426.459 | 427.945 |
| 87.67199702491634 | -32.909 | -1.218 | 428.594 | 430.127 |
| 87.83004834510972 | -32.893 | -2.641 | 427.945 | 429.495 |
| 87.99739680178506 | -32.941 | -2.957 | 427.313 | 428.878 |
| 88.1647452584604 | -32.941 | -2.704 | 426.87 | 428.435 |
| 88.33209371513574 | -32.134 | -3.542 | 424.498 | 426 |
| 88.49944217181108 | -31.834 | -3.637 | 421.999 | 423.486 |
| 88.66679062848644 | -32.656 | -3.732 | 420.702 | 422.236 |
| 88.83413908516178 | -33.51 | -4.017 | 419.326 | 420.908 |
| 89.00148754183712 | -34.57 | -4.064 | 421.351 | 423.011 |
| 89.16883599851246 | -34.918 | -4.428 | 421.129 | 422.837 |
| 89.33618445518782 | -34.838 | -4.887 | 419.437 | 421.177 |
| 89.50353291186315 | -35.329 | -4.744 | 417.84 | 419.643 |
| 89.6708813685385 | -36.104 | -4.523 | 417.033 | 418.931 |
| 89.83822982521386 | -36.689 | -4.823 | 417.982 | 419.959 |
| 90.00557828188919 | -36.736 | -4.776 | 418.283 | 420.307 |
| 90.16362960208257 | -37.321 | -5.124 | 413.934 | 416.085 |
| 90.3309780587579 | -36.989 | -5.851 | 410.929 | 413.096 |
| 90.49832651543326 | -36.989 | -5.614 | 410.787 | 412.953 |
| 90.66567497210859 | -35.487 | -6.863 | 412.4 | 414.361 |
| 90.83302342878395 | -34.965 | -6.974 | 415.12 | 416.986 |
| 91.00037188545929 | -35.044 | -7.543 | 414.266 | 416.164 |
| 91.16772034213463 | -35.392 | -8.065 | 412.795 | 414.772 |
| 91.33506879880998 | -35.708 | -8.634 | 411.325 | 413.38 |
| 91.50241725548533 | -35.851 | -9.22 | 407.751 | 409.885 |
| 91.66976571216065 | -35.945 | -9.536 | 404.43 | 406.612 |
| 91.83711416883601 | -36.024 | -9.077 | 404.983 | 407.15 |
| 92.00446262551137 | -36.072 | -8.429 | 407.229 | 409.332 |
| 92.1718110821867 | -35.977 | -7.875 | 408.383 | 410.407 |
| 92.33915953886203 | -35.265 | -7.417 | 409.016 | 410.929 |
| 92.49721085905541 | -34.538 | -6.784 | 409.711 | 411.53 |
| 92.66455931573077 | -33.652 | -6.547 | 411.562 | 413.254 |
| 92.83190777240611 | -32.15 | -6.942 | 416.448 | 417.951 |
| 92.99925622908145 | -30.948 | -6.753 | 419.88 | 421.256 |
| 93.1666046857568 | -30.395 | -6.563 | 421.287 | 422.616 |
| 93.33395314243214 | -30.837 | -5.851 | 423.486 | 424.846 |
| 93.50130159910749 | -31.154 | -5.314 | 425.225 | 426.601 |
| 93.66865005578283 | -30.98 | -5.472 | 424.703 | 426.063 |
| 93.83599851245818 | -30.774 | -5.282 | 423.359 | 424.719 |
| 94.00334696913353 | -30.047 | -5.013 | 426.285 | 427.566 |
| 94.17069542580886 | -29.43 | -5.092 | 426.569 | 427.819 |
| 94.3380438824842 | -29.73 | -5.456 | 425.62 | 426.917 |
| 94.50539233915954 | -30.632 | -5.487 | 426.411 | 427.803 |
| 94.66344365935292 | -31.691 | -5.63 | 426 | 427.487 |
| 94.83079211602828 | -31.691 | -6.436 | 426.933 | 428.404 |
| 94.99814057270362 | -31.723 | -6.8 | 426.411 | 427.913 |
| 95.16548902937897 | -31.929 | -6.658 | 426.032 | 427.55 |
| 95.33283748605432 | -32.197 | -6.436 | 427.629 | 429.147 |
| 95.50018594272963 | -32.514 | -6.199 | 431.298 | 432.8 |
| 95.66753439940499 | -32.798 | -6.057 | 430.744 | 432.262 |
| 95.83488285608034 | -33.036 | -6.341 | 428.151 | 429.716 |
| 96.00223131275567 | -32.688 | -6.5 | 426.538 | 428.056 |
| 96.16957976943102 | -32.451 | -6.626 | 424.64 | 426.158 |
| 96.33692822610638 | -33.21 | -5.899 | 421.24 | 422.837 |
| 96.50427668278171 | -33.004 | -6.215 | 418.536 | 420.149 |
| 96.67162513945706 | -32.862 | -6.373 | 417.508 | 419.121 |
| 96.8389735961324 | -33.795 | -5.899 | 415.832 | 417.508 |
| 96.99702491632577 | -34.269 | -5.456 | 419.247 | 420.924 |
| 97.16437337300111 | -33.811 | -5.535 | 420.481 | 422.094 |
| 97.33172182967647 | -33.384 | -5.693 | 421.509 | 423.09 |
| 97.49907028635181 | -33.067 | -6.088 | 422.031 | 423.612 |
| 97.66641874302715 | -33.257 | -6.326 | 422.157 | 423.754 |
| 97.8337671997025 | -33.969 | -5.93 | 424.213 | 425.858 |
| 98.00111565637785 | -34.933 | -4.491 | 430.713 | 432.405 |
| 98.16846411305319 | -34.301 | -6.436 | 432.215 | 433.86 |
| 98.33581256972855 | -34.364 | -6.737 | 432.942 | 434.571 |
| 98.50316102640389 | -34.364 | -6.958 | 433.116 | 434.745 |
| 98.67050948307921 | -33.51 | -7.543 | 432.674 | 434.271 |
| 98.83785793975456 | -34.19 | -6.863 | 429.795 | 431.456 |
| 99.0052063964299 | -33.937 | -7.306 | 425.399 | 427.06 |
| 99.17255485310525 | -34.048 | -7.164 | 423.675 | 425.336 |
| 99.33060617329863 | -34.285 | -6.99 | 423.296 | 424.972 |
| 99.49795462997399 | -34.048 | -7.338 | 421.952 | 423.612 |
| 99.66530308664933 | -34.158 | -7.053 | 419.595 | 421.256 |
| 99.83265154332467 | -34.87 | -6.262 | 420.101 | 421.825 |
| 100.0 | -35.661 | -5.661 | 422.299 | 424.071 |